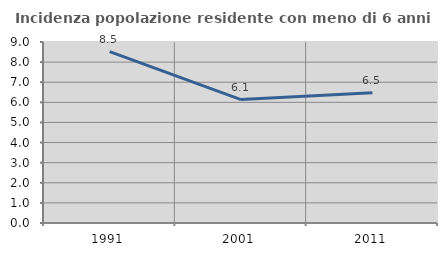
| Category | Incidenza popolazione residente con meno di 6 anni |
|---|---|
| 1991.0 | 8.523 |
| 2001.0 | 6.138 |
| 2011.0 | 6.473 |